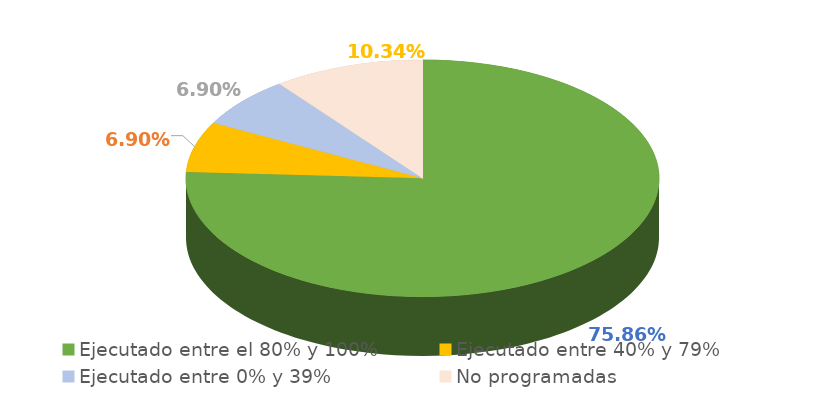
| Category | Series 0 |
|---|---|
| Ejecutado entre el 80% y 100% | 0.759 |
| Ejecutado entre 40% y 79% | 0.069 |
| Ejecutado entre 0% y 39% | 0.069 |
| No programadas | 0.103 |